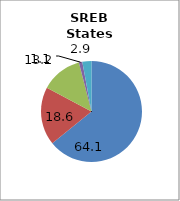
| Category | SREB states2 |
|---|---|
| White | 64.134 |
| Black | 18.619 |
| Hispanic | 13.218 |
| Two or More Races | 1.107 |
| All Other1 | 2.922 |